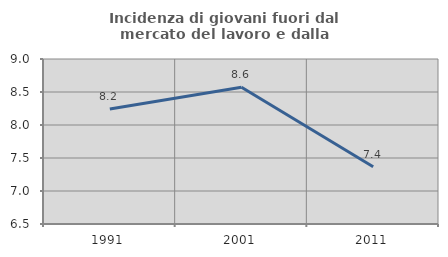
| Category | Incidenza di giovani fuori dal mercato del lavoro e dalla formazione  |
|---|---|
| 1991.0 | 8.242 |
| 2001.0 | 8.571 |
| 2011.0 | 7.368 |